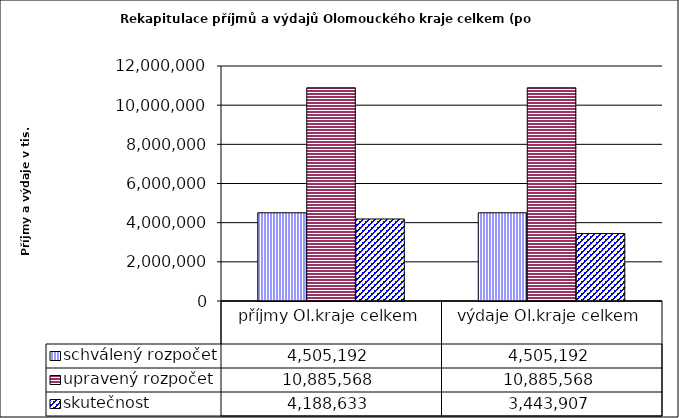
| Category | schválený rozpočet | upravený rozpočet | skutečnost |
|---|---|---|---|
| příjmy Ol.kraje celkem | 4505192 | 10885568 | 4188633 |
| výdaje Ol.kraje celkem | 4505192 | 10885568 | 3443907 |